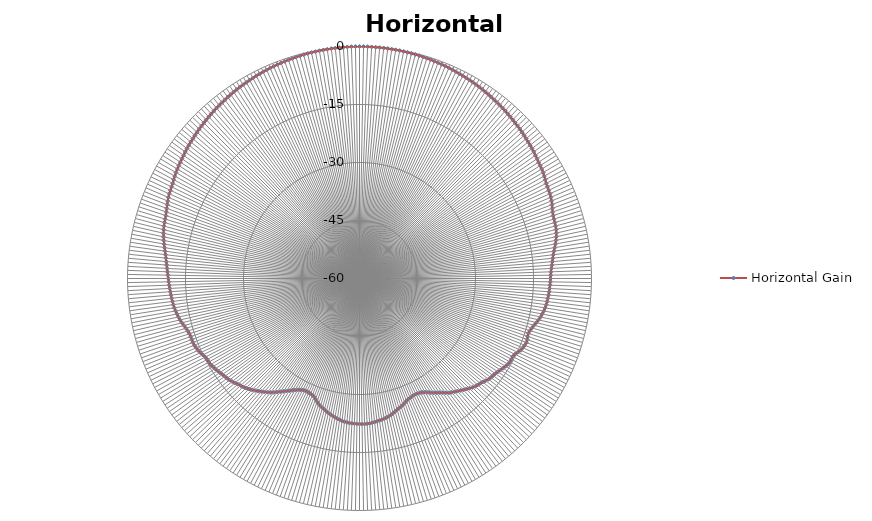
| Category | Horizontal Gain | Series 1 |
|---|---|---|
| 0 | 0 |  |
| 1 | 0 |  |
| 2 | -0.01 |  |
| 3 | -0.02 |  |
| 4 | -0.04 |  |
| 5 | -0.05 |  |
| 6 | -0.06 |  |
| 7 | -0.08 |  |
| 8 | -0.11 |  |
| 9 | -0.13 |  |
| 10 | -0.16 |  |
| 11 | -0.19 |  |
| 12 | -0.22 |  |
| 13 | -0.26 |  |
| 14 | -0.3 |  |
| 15 | -0.34 |  |
| 16 | -0.39 |  |
| 17 | -0.45 |  |
| 18 | -0.51 |  |
| 19 | -0.57 |  |
| 20 | -0.63 |  |
| 21 | -0.69 |  |
| 22 | -0.75 |  |
| 23 | -0.82 |  |
| 24 | -0.9 |  |
| 25 | -0.99 |  |
| 26 | -1.08 |  |
| 27 | -1.16 |  |
| 28 | -1.24 |  |
| 29 | -1.31 |  |
| 30 | -1.4 |  |
| 31 | -1.49 |  |
| 32 | -1.58 |  |
| 33 | -1.69 |  |
| 34 | -1.79 |  |
| 35 | -1.91 |  |
| 36 | -2.02 |  |
| 37 | -2.13 |  |
| 38 | -2.23 |  |
| 39 | -2.34 |  |
| 40 | -2.44 |  |
| 41 | -2.56 |  |
| 42 | -2.69 |  |
| 43 | -2.82 |  |
| 44 | -2.95 |  |
| 45 | -3.07 |  |
| 46 | -3.19 |  |
| 47 | -3.32 |  |
| 48 | -3.46 |  |
| 49 | -3.6 |  |
| 50 | -3.74 |  |
| 51 | -3.87 |  |
| 52 | -4 |  |
| 53 | -4.14 |  |
| 54 | -4.29 |  |
| 55 | -4.45 |  |
| 56 | -4.62 |  |
| 57 | -4.78 |  |
| 58 | -4.91 |  |
| 59 | -5.02 |  |
| 60 | -5.15 |  |
| 61 | -5.36 |  |
| 62 | -5.59 |  |
| 63 | -5.81 |  |
| 64 | -5.92 |  |
| 65 | -6 |  |
| 66 | -6.08 |  |
| 67 | -6.23 |  |
| 68 | -6.42 |  |
| 69 | -6.66 |  |
| 70 | -6.94 |  |
| 71 | -7.19 |  |
| 72 | -7.34 |  |
| 73 | -7.41 |  |
| 74 | -7.44 |  |
| 75 | -7.5 |  |
| 76 | -7.6 |  |
| 77 | -7.74 |  |
| 78 | -7.96 |  |
| 79 | -8.23 |  |
| 80 | -8.53 |  |
| 81 | -8.87 |  |
| 82 | -9.21 |  |
| 83 | -9.51 |  |
| 84 | -9.75 |  |
| 85 | -9.94 |  |
| 86 | -10.13 |  |
| 87 | -10.31 |  |
| 88 | -10.46 |  |
| 89 | -10.55 |  |
| 90 | -10.6 |  |
| 91 | -10.64 |  |
| 92 | -10.7 |  |
| 93 | -10.77 |  |
| 94 | -10.84 |  |
| 95 | -10.92 |  |
| 96 | -11.01 |  |
| 97 | -11.12 |  |
| 98 | -11.25 |  |
| 99 | -11.41 |  |
| 100 | -11.61 |  |
| 101 | -11.86 |  |
| 102 | -12.13 |  |
| 103 | -12.47 |  |
| 104 | -12.86 |  |
| 105 | -13.26 |  |
| 106 | -13.62 |  |
| 107 | -13.91 |  |
| 108 | -14.12 |  |
| 109 | -14.01 |  |
| 110 | -13.85 |  |
| 111 | -13.77 |  |
| 112 | -13.91 |  |
| 113 | -14.11 |  |
| 114 | -14.4 |  |
| 115 | -14.85 |  |
| 116 | -15.31 |  |
| 117 | -15.53 |  |
| 118 | -15.52 |  |
| 119 | -15.5 |  |
| 120 | -15.68 |  |
| 121 | -15.95 |  |
| 122 | -16.24 |  |
| 123 | -16.54 |  |
| 124 | -16.85 |  |
| 125 | -17.13 |  |
| 126 | -17.3 |  |
| 127 | -17.45 |  |
| 128 | -17.67 |  |
| 129 | -18.01 |  |
| 130 | -18.36 |  |
| 131 | -18.65 |  |
| 132 | -18.86 |  |
| 133 | -19.09 |  |
| 134 | -19.43 |  |
| 135 | -19.84 |  |
| 136 | -20.25 |  |
| 137 | -20.64 |  |
| 138 | -21.02 |  |
| 139 | -21.4 |  |
| 140 | -21.75 |  |
| 141 | -22.1 |  |
| 142 | -22.48 |  |
| 143 | -22.98 |  |
| 144 | -23.5 |  |
| 145 | -23.97 |  |
| 146 | -24.37 |  |
| 147 | -24.76 |  |
| 148 | -25.19 |  |
| 149 | -25.64 |  |
| 150 | -26.05 |  |
| 151 | -26.33 |  |
| 152 | -26.54 |  |
| 153 | -26.67 |  |
| 154 | -26.73 |  |
| 155 | -26.7 |  |
| 156 | -26.62 |  |
| 157 | -26.5 |  |
| 158 | -26.34 |  |
| 159 | -26.09 |  |
| 160 | -25.78 |  |
| 161 | -25.46 |  |
| 162 | -25.19 |  |
| 163 | -24.95 |  |
| 164 | -24.7 |  |
| 165 | -24.39 |  |
| 166 | -24.08 |  |
| 167 | -23.8 |  |
| 168 | -23.57 |  |
| 169 | -23.37 |  |
| 170 | -23.19 |  |
| 171 | -23.05 |  |
| 172 | -22.92 |  |
| 173 | -22.8 |  |
| 174 | -22.67 |  |
| 175 | -22.55 |  |
| 176 | -22.45 |  |
| 177 | -22.38 |  |
| 178 | -22.35 |  |
| 179 | -22.34 |  |
| 180 | -22.37 |  |
| 181 | -22.41 |  |
| 182 | -22.44 |  |
| 183 | -22.49 |  |
| 184 | -22.55 |  |
| 185 | -22.64 |  |
| 186 | -22.76 |  |
| 187 | -22.91 |  |
| 188 | -23.1 |  |
| 189 | -23.31 |  |
| 190 | -23.54 |  |
| 191 | -23.78 |  |
| 192 | -24.04 |  |
| 193 | -24.31 |  |
| 194 | -24.6 |  |
| 195 | -24.91 |  |
| 196 | -25.2 |  |
| 197 | -25.5 |  |
| 198 | -25.83 |  |
| 199 | -26.3 |  |
| 200 | -26.8 |  |
| 201 | -27.24 |  |
| 202 | -27.48 |  |
| 203 | -27.62 |  |
| 204 | -27.71 |  |
| 205 | -27.79 |  |
| 206 | -27.76 |  |
| 207 | -27.62 |  |
| 208 | -27.38 |  |
| 209 | -27.07 |  |
| 210 | -26.69 |  |
| 211 | -26.26 |  |
| 212 | -25.78 |  |
| 213 | -25.3 |  |
| 214 | -24.8 |  |
| 215 | -24.27 |  |
| 216 | -23.7 |  |
| 217 | -23.14 |  |
| 218 | -22.63 |  |
| 219 | -22.16 |  |
| 220 | -21.7 |  |
| 221 | -21.26 |  |
| 222 | -20.82 |  |
| 223 | -20.4 |  |
| 224 | -19.99 |  |
| 225 | -19.58 |  |
| 226 | -19.2 |  |
| 227 | -18.89 |  |
| 228 | -18.61 |  |
| 229 | -18.33 |  |
| 230 | -17.98 |  |
| 231 | -17.64 |  |
| 232 | -17.34 |  |
| 233 | -17.13 |  |
| 234 | -16.94 |  |
| 235 | -16.71 |  |
| 236 | -16.44 |  |
| 237 | -16.19 |  |
| 238 | -15.96 |  |
| 239 | -15.75 |  |
| 240 | -15.55 |  |
| 241 | -15.45 |  |
| 242 | -15.37 |  |
| 243 | -15.26 |  |
| 244 | -14.93 |  |
| 245 | -14.59 |  |
| 246 | -14.3 |  |
| 247 | -14.11 |  |
| 248 | -13.94 |  |
| 249 | -13.85 |  |
| 250 | -13.86 |  |
| 251 | -13.86 |  |
| 252 | -13.75 |  |
| 253 | -13.55 |  |
| 254 | -13.3 |  |
| 255 | -13.01 |  |
| 256 | -12.69 |  |
| 257 | -12.38 |  |
| 258 | -12.13 |  |
| 259 | -11.9 |  |
| 260 | -11.7 |  |
| 261 | -11.53 |  |
| 262 | -11.38 |  |
| 263 | -11.25 |  |
| 264 | -11.15 |  |
| 265 | -11.05 |  |
| 266 | -10.96 |  |
| 267 | -10.86 |  |
| 268 | -10.75 |  |
| 269 | -10.65 |  |
| 270 | -10.55 |  |
| 271 | -10.43 |  |
| 272 | -10.3 |  |
| 273 | -10.16 |  |
| 274 | -10 |  |
| 275 | -9.84 |  |
| 276 | -9.66 |  |
| 277 | -9.45 |  |
| 278 | -9.21 |  |
| 279 | -8.95 |  |
| 280 | -8.7 |  |
| 281 | -8.44 |  |
| 282 | -8.2 |  |
| 283 | -7.99 |  |
| 284 | -7.81 |  |
| 285 | -7.65 |  |
| 286 | -7.54 |  |
| 287 | -7.45 |  |
| 288 | -7.34 |  |
| 289 | -7.16 |  |
| 290 | -6.96 |  |
| 291 | -6.74 |  |
| 292 | -6.51 |  |
| 293 | -6.3 |  |
| 294 | -6.14 |  |
| 295 | -6.04 |  |
| 296 | -5.93 |  |
| 297 | -5.78 |  |
| 298 | -5.58 |  |
| 299 | -5.37 |  |
| 300 | -5.2 |  |
| 301 | -5.04 |  |
| 302 | -4.9 |  |
| 303 | -4.76 |  |
| 304 | -4.61 |  |
| 305 | -4.46 |  |
| 306 | -4.3 |  |
| 307 | -4.13 |  |
| 308 | -3.99 |  |
| 309 | -3.86 |  |
| 310 | -3.74 |  |
| 311 | -3.61 |  |
| 312 | -3.47 |  |
| 313 | -3.33 |  |
| 314 | -3.2 |  |
| 315 | -3.08 |  |
| 316 | -2.96 |  |
| 317 | -2.83 |  |
| 318 | -2.7 |  |
| 319 | -2.58 |  |
| 320 | -2.47 |  |
| 321 | -2.36 |  |
| 322 | -2.26 |  |
| 323 | -2.15 |  |
| 324 | -2.04 |  |
| 325 | -1.93 |  |
| 326 | -1.82 |  |
| 327 | -1.72 |  |
| 328 | -1.62 |  |
| 329 | -1.53 |  |
| 330 | -1.45 |  |
| 331 | -1.36 |  |
| 332 | -1.28 |  |
| 333 | -1.19 |  |
| 334 | -1.11 |  |
| 335 | -1.03 |  |
| 336 | -0.95 |  |
| 337 | -0.88 |  |
| 338 | -0.81 |  |
| 339 | -0.75 |  |
| 340 | -0.69 |  |
| 341 | -0.63 |  |
| 342 | -0.57 |  |
| 343 | -0.51 |  |
| 344 | -0.45 |  |
| 345 | -0.4 |  |
| 346 | -0.35 |  |
| 347 | -0.31 |  |
| 348 | -0.27 |  |
| 349 | -0.24 |  |
| 350 | -0.2 |  |
| 351 | -0.17 |  |
| 352 | -0.13 |  |
| 353 | -0.11 |  |
| 354 | -0.09 |  |
| 355 | -0.07 |  |
| 356 | -0.05 |  |
| 357 | -0.03 |  |
| 358 | -0.01 |  |
| 359 | 0 |  |